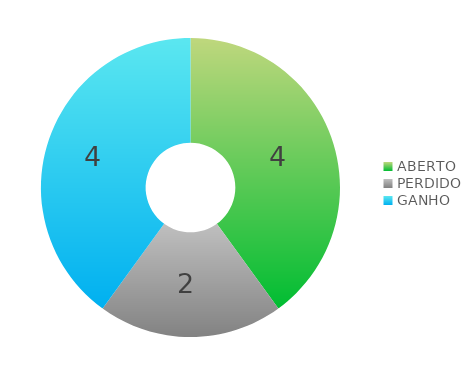
| Category | Series 0 |
|---|---|
| ABERTO | 4 |
| PERDIDO | 2 |
| GANHO | 4 |